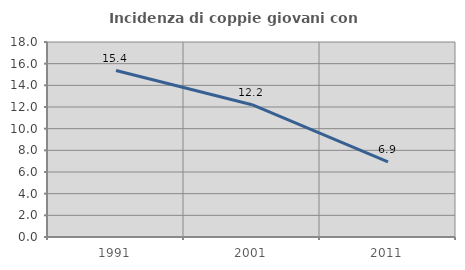
| Category | Incidenza di coppie giovani con figli |
|---|---|
| 1991.0 | 15.365 |
| 2001.0 | 12.21 |
| 2011.0 | 6.942 |